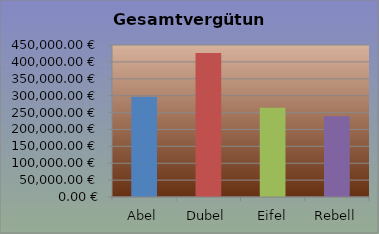
| Category | Gesamtvergütung |
|---|---|
| Abel | 296577.1 |
| Dubel | 426052.09 |
| Eifel | 264224.96 |
| Rebell | 239139.24 |